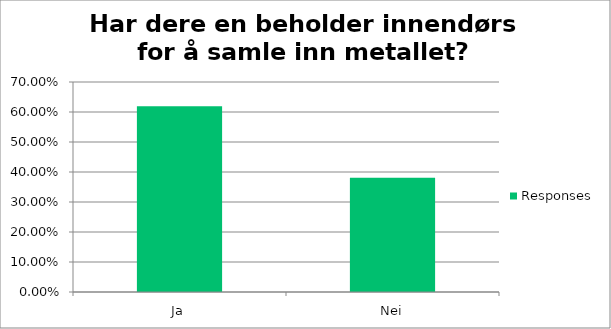
| Category | Responses |
|---|---|
| Ja | 0.619 |
| Nei | 0.381 |